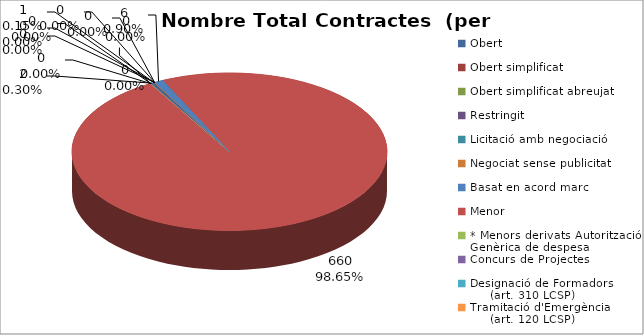
| Category | Nombre Total Contractes |
|---|---|
| Obert | 2 |
| Obert simplificat | 1 |
| Obert simplificat abreujat | 0 |
| Restringit | 0 |
| Licitació amb negociació | 0 |
| Negociat sense publicitat | 0 |
| Basat en acord marc | 6 |
| Menor | 660 |
| * Menors derivats Autorització Genèrica de despesa | 0 |
| Concurs de Projectes | 0 |
| Designació de Formadors
     (art. 310 LCSP) | 0 |
| Tramitació d'Emergència
     (art. 120 LCSP) | 0 |